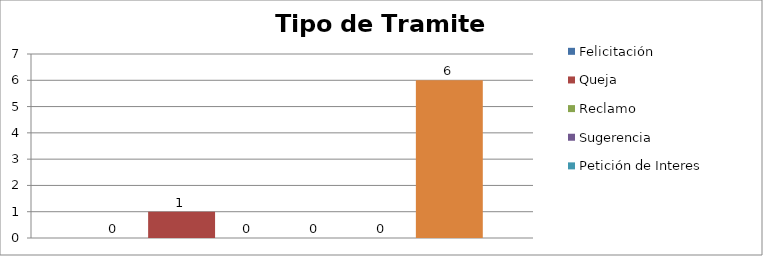
| Category | Felicitación | Queja | Reclamo | Sugerencia | Petición de Interes General | Petición de Interes Particular |
|---|---|---|---|---|---|---|
| 0 | 0 | 1 | 0 | 0 | 0 | 6 |